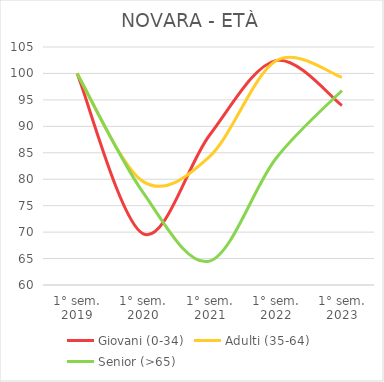
| Category | Giovani (0-34) | Adulti (35-64) | Senior (>65) |
|---|---|---|---|
| 1° sem.
2019 | 100 | 100 | 100 |
| 1° sem.
2020 | 69.673 | 79.548 | 77.419 |
| 1° sem.
2021 | 88.317 | 84.253 | 64.516 |
| 1° sem.
2022 | 102.421 | 102.353 | 83.871 |
| 1° sem.
2023 | 93.947 | 99.276 | 96.774 |